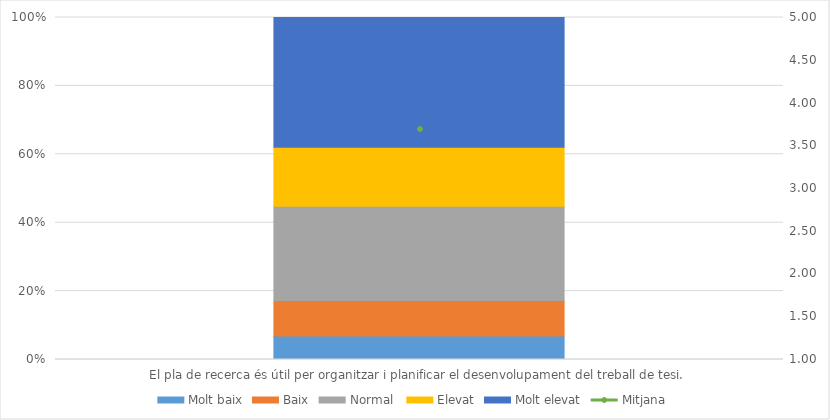
| Category | Molt baix | Baix | Normal  | Elevat | Molt elevat |
|---|---|---|---|---|---|
| El pla de recerca és útil per organitzar i planificar el desenvolupament del treball de tesi. | 2 | 3 | 8 | 5 | 11 |